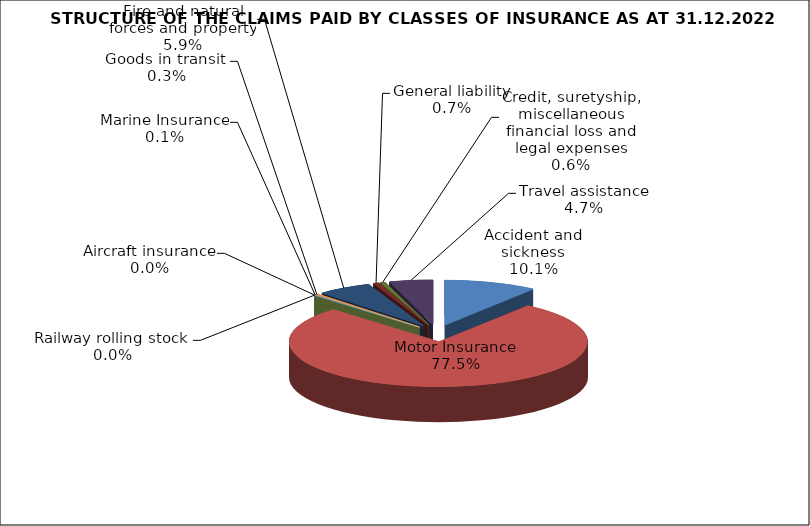
| Category | Accident and sickness |
|---|---|
| Accident and sickness | 0.101 |
| Motor Insurance | 0.775 |
| Railway rolling stock  | 0 |
| Aircraft insurance | 0 |
| Marine Insurance | 0.001 |
| Goods in transit  | 0.003 |
| Fire and natural forces and property | 0.059 |
| General liability | 0.007 |
| Credit, suretyship, miscellaneous financial loss and legal expenses | 0.006 |
| Travel assistance | 0.047 |